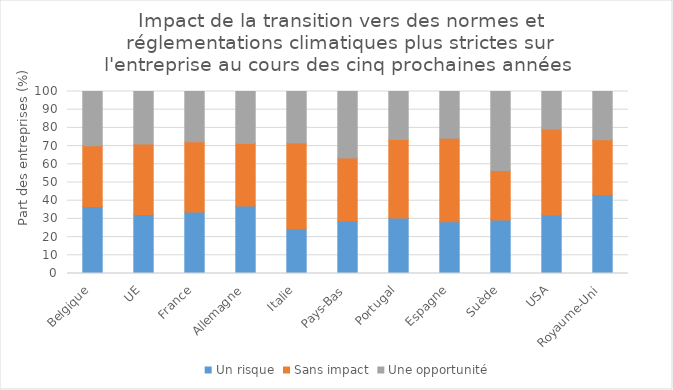
| Category | Un risque | Sans impact | Une opportunité |
|---|---|---|---|
|   Belgique | 36.75 | 33.44 | 29.81 |
|   UE | 32.38 | 38.73 | 28.89 |
|   France | 33.79 | 38.63 | 27.58 |
|   Allemagne | 37.11 | 34.26 | 28.62 |
|   Italie | 24.45 | 47.19 | 28.36 |
|   Pays-Bas | 28.91 | 34.55 | 36.54 |
|   Portugal | 30.46 | 43.21 | 26.33 |
|   Espagne | 28.45 | 45.89 | 25.66 |
|   Suède | 29.38 | 27.23 | 43.39 |
|   USA | 32.14 | 47.19 | 20.68 |
| Royaume-Uni | 43.3 | 30.21 | 26.49 |